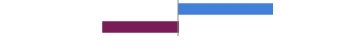
| Category | Series 0 |
|---|---|
| Favorable | 0.531 |
| Unfavorable | -0.428 |